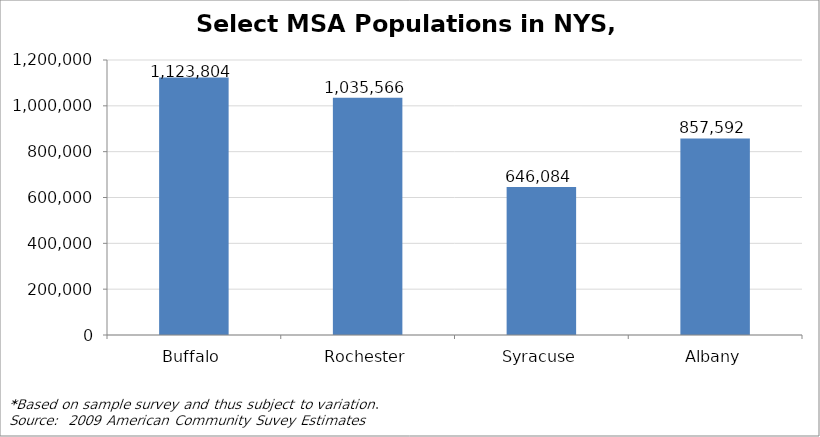
| Category | Series 0 |
|---|---|
| Buffalo | 1123804 |
| Rochester | 1035566 |
| Syracuse | 646084 |
| Albany | 857592 |